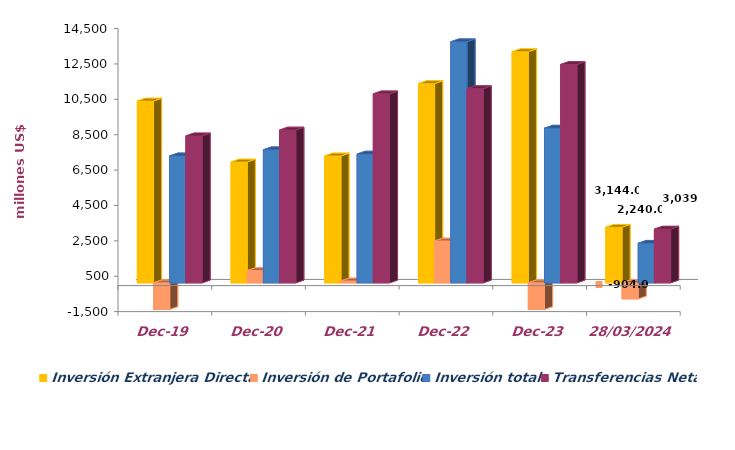
| Category | Inversión Extranjera Directa | Inversión de Portafolio | Inversión total | Transferencias Netas |
|---|---|---|---|---|
| dic-19 | 10279.712 | -3100.715 | 7178.997 | 8308 |
| dic-20 | 6831.407 | 693.732 | 7525.139 | 8640 |
| dic-21 | 7174.272 | 107.472 | 7281.744 | 10685 |
| dic-22 | 11263 | 2367 | 13630 | 10978 |
| dic-23 | 13068 | -4320 | 8748 | 12347 |
| 28/03/2024 | 3144 | -904 | 2240 | 3039 |